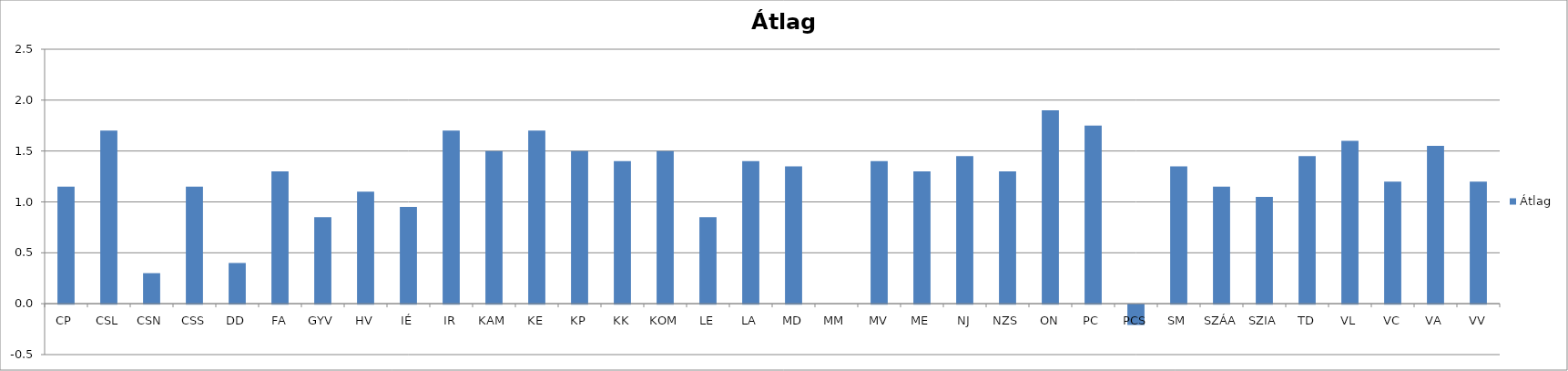
| Category | Átlag |
|---|---|
| CP | 1.15 |
| CSL | 1.7 |
| CSN | 0.3 |
| CSS | 1.15 |
| DD | 0.4 |
| FA | 1.3 |
| GYV | 0.85 |
| HV | 1.1 |
| IÉ | 0.95 |
| IR | 1.7 |
| KAM | 1.5 |
| KE | 1.7 |
| KP | 1.5 |
| KK | 1.4 |
| KOM | 1.5 |
| LE | 0.85 |
| LA | 1.4 |
| MD | 1.35 |
| MM | 0 |
| MV | 1.4 |
| ME | 1.3 |
| NJ | 1.45 |
| NZS | 1.3 |
| ON | 1.9 |
| PC | 1.75 |
| PCS | -0.2 |
| SM | 1.35 |
| SZÁA | 1.15 |
| SZIA | 1.05 |
| TD | 1.45 |
| VL | 1.6 |
| VC | 1.2 |
| VA | 1.55 |
| VV | 1.2 |